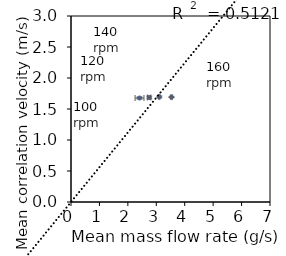
| Category | Series 0 |
|---|---|
| 2.4104666666666668 | 1.677 |
| 2.7510333333333334 | 1.686 |
| 3.106333333333333 | 1.695 |
| 3.5353666666666665 | 1.692 |